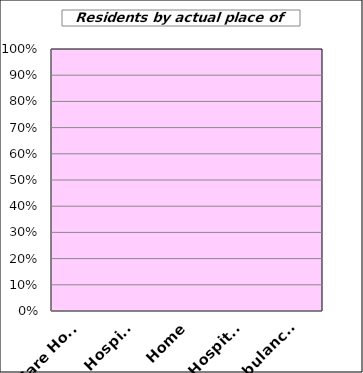
| Category | Pre-Programme | Post-Programme |
|---|---|---|
| Care Home | 0 | 0 |
| Hospice | 0 | 0 |
| Home | 0 | 0 |
| Hospital | 0 | 0 |
| Ambulance  | 0 | 0 |